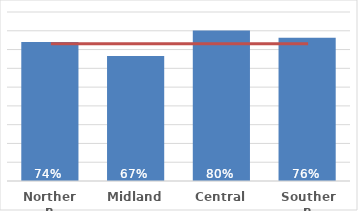
| Category | Māori |
|---|---|
| Northern | 0.74 |
| Midland | 0.666 |
| Central | 0.801 |
| Southern | 0.763 |